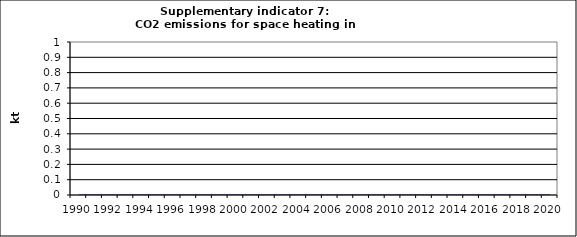
| Category | CO2 emissions for space heating in households, kt |
|---|---|
| 1990 | 0 |
| 1991 | 0 |
| 1992 | 0 |
| 1993 | 0 |
| 1994 | 0 |
| 1995 | 0 |
| 1996 | 0 |
| 1997 | 0 |
| 1998 | 0 |
| 1999 | 0 |
| 2000 | 0 |
| 2001 | 0 |
| 2002 | 0 |
| 2003 | 0 |
| 2004 | 0 |
| 2005 | 0 |
| 2006 | 0 |
| 2007 | 0 |
| 2008 | 0 |
| 2009 | 0 |
| 2010 | 0 |
| 2011 | 0 |
| 2012 | 0 |
| 2013 | 0 |
| 2014 | 0 |
| 2015 | 0 |
| 2016 | 0 |
| 2017 | 0 |
| 2018 | 0 |
| 2019 | 0 |
| 2020 | 0 |